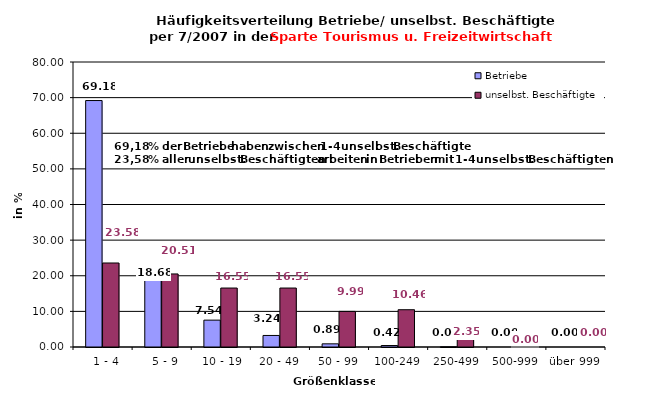
| Category | Betriebe | unselbst. Beschäftigte |
|---|---|---|
|   1 - 4 | 69.181 | 23.58 |
|   5 - 9 | 18.683 | 20.508 |
|  10 - 19 | 7.542 | 16.549 |
| 20 - 49 | 3.237 | 16.552 |
| 50 - 99 | 0.886 | 9.991 |
| 100-249 | 0.416 | 10.465 |
| 250-499 | 0.054 | 2.355 |
| 500-999 | 0 | 0 |
| über 999 | 0 | 0 |